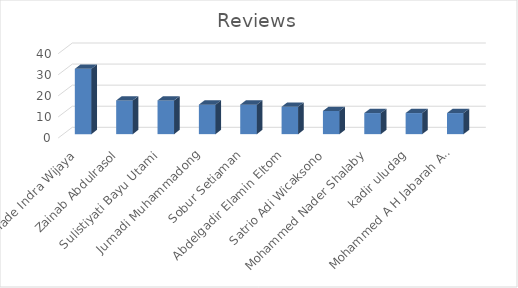
| Category | Reviews |
|---|---|
| Made Indra Wijaya | 31 |
| Zainab Abdulrasol | 16 |
| Sulistiyati Bayu Utami | 16 |
| Jumadi Muhammadong | 14 |
| Sobur Setiaman | 14 |
| Abdelgadir Elamin Eltom | 13 |
| Satrio Adi Wicaksono | 11 |
| Mohammed Nader Shalaby | 10 |
| kadir uludag | 10 |
| Mohammed A H Jabarah AL-Zobaidy | 10 |